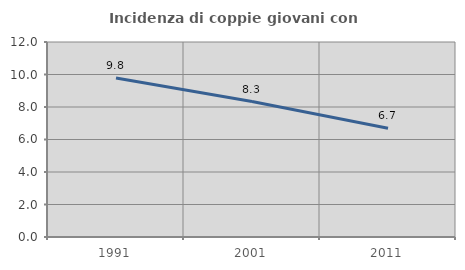
| Category | Incidenza di coppie giovani con figli |
|---|---|
| 1991.0 | 9.787 |
| 2001.0 | 8.333 |
| 2011.0 | 6.696 |